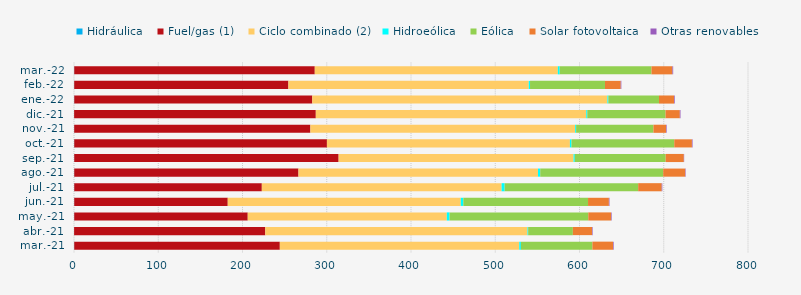
| Category | Hidráulica | Fuel/gas (1) | Ciclo combinado (2) | Hidroeólica | Eólica | Solar fotovoltaica | Otras renovables |
|---|---|---|---|---|---|---|---|
| mar.-21 | 0.282 | 244.022 | 284.196 | 1.921 | 84.883 | 24.504 | 0.792 |
| abr.-21 | 0.138 | 226.895 | 311.21 | 0.836 | 53.036 | 22.758 | 0.722 |
| may.-21 | 0.268 | 205.958 | 236.283 | 3.227 | 164.671 | 27.093 | 0.723 |
| jun.-21 | 0.282 | 182.213 | 276.616 | 3.002 | 148.018 | 24.742 | 0.724 |
| jul.-21 | 0.29 | 222.639 | 284.61 | 3.578 | 158.516 | 27.938 | 0.734 |
| ago.-21 | 0.281 | 266.149 | 284.301 | 2.663 | 145.95 | 26.121 | 0.57 |
| sep.-21 | 0.278 | 313.815 | 278.888 | 1.42 | 107.853 | 21.565 | 0.4 |
| oct.-21 | 0.282 | 299.917 | 288.429 | 1.853 | 121.987 | 20.979 | 0.756 |
| nov.-21 | 0.231 | 280.341 | 314.273 | 1.14 | 91.77 | 14.946 | 0.753 |
| dic.-21 | 0.155 | 286.856 | 321.013 | 1.228 | 92.868 | 16.937 | 0.822 |
| ene.-22 | 0.294 | 282.523 | 350.314 | 1.111 | 60.108 | 17.847 | 0.861 |
| feb.-22 | 0.251 | 254.215 | 285.333 | 1.482 | 88.97 | 18.69 | 0.721 |
| mar.-22 | 0.296 | 285.489 | 288.518 | 2.126 | 108.992 | 24.856 | 0.91 |